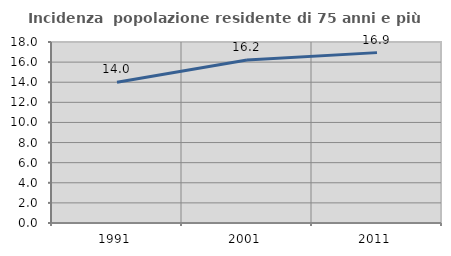
| Category | Incidenza  popolazione residente di 75 anni e più |
|---|---|
| 1991.0 | 14.003 |
| 2001.0 | 16.214 |
| 2011.0 | 16.943 |